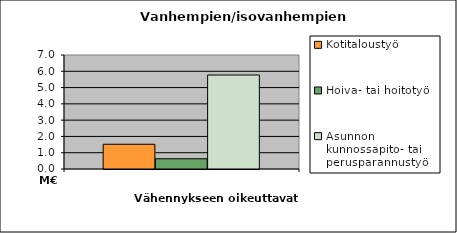
| Category | Kotitaloustyö | Hoiva- tai hoitotyö | Asunnon kunnossapito- tai perusparannustyö |
|---|---|---|---|
| 0 | 1519137.72 | 628530.51 | 5770328.67 |